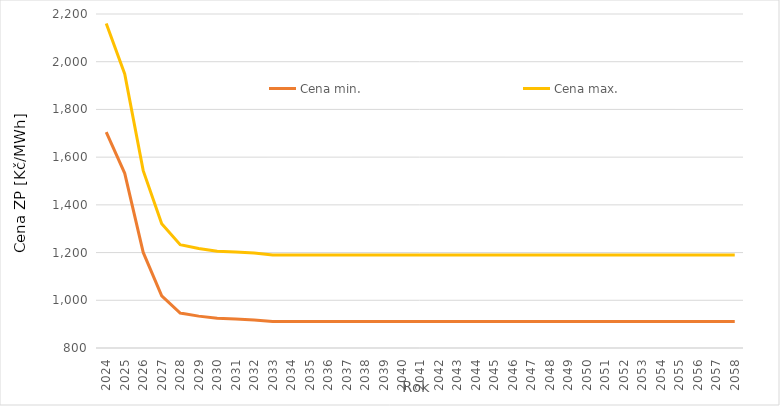
| Category | Cena min. | Cena max. |
|---|---|---|
| 2024.0 | 1705.149 | 2160.282 |
| 2025.0 | 1532.054 | 1948.722 |
| 2026.0 | 1200.473 | 1543.456 |
| 2027.0 | 1018.412 | 1320.937 |
| 2028.0 | 946.657 | 1233.236 |
| 2029.0 | 933.58 | 1217.253 |
| 2030.0 | 924.281 | 1205.888 |
| 2031.0 | 921.203 | 1202.126 |
| 2032.0 | 917.743 | 1197.897 |
| 2033.0 | 911.491 | 1190.256 |
| 2034.0 | 911.491 | 1190.256 |
| 2035.0 | 911.491 | 1190.256 |
| 2036.0 | 911.491 | 1190.256 |
| 2037.0 | 911.491 | 1190.256 |
| 2038.0 | 911.491 | 1190.256 |
| 2039.0 | 911.491 | 1190.256 |
| 2040.0 | 911.491 | 1190.256 |
| 2041.0 | 911.491 | 1190.256 |
| 2042.0 | 911.491 | 1190.256 |
| 2043.0 | 911.491 | 1190.256 |
| 2044.0 | 911.491 | 1190.256 |
| 2045.0 | 911.491 | 1190.256 |
| 2046.0 | 911.491 | 1190.256 |
| 2047.0 | 911.491 | 1190.256 |
| 2048.0 | 911.491 | 1190.256 |
| 2049.0 | 911.491 | 1190.256 |
| 2050.0 | 911.491 | 1190.256 |
| 2051.0 | 911.491 | 1190.256 |
| 2052.0 | 911.491 | 1190.256 |
| 2053.0 | 911.491 | 1190.256 |
| 2054.0 | 911.491 | 1190.256 |
| 2055.0 | 911.491 | 1190.256 |
| 2056.0 | 911.491 | 1190.256 |
| 2057.0 | 911.491 | 1190.256 |
| 2058.0 | 911.491 | 1190.256 |